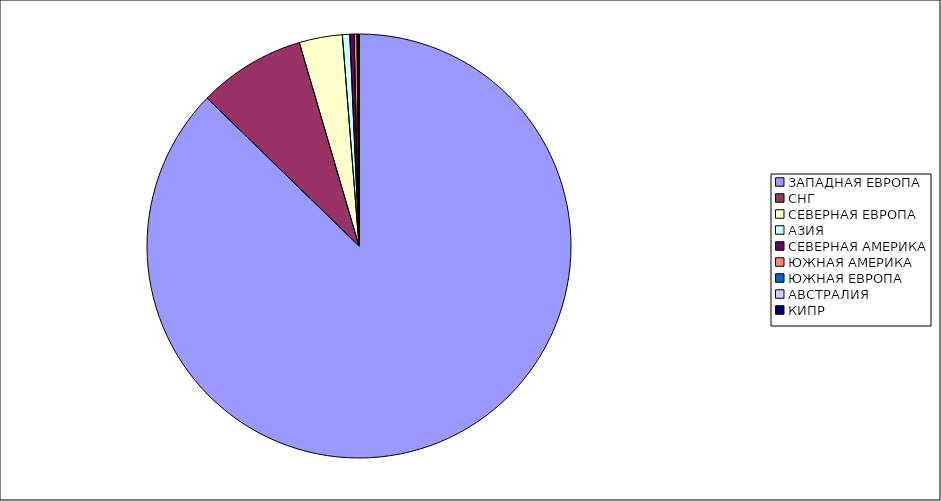
| Category | Оборот |
|---|---|
| ЗАПАДНАЯ ЕВРОПА | 0.873 |
| СНГ | 0.082 |
| СЕВЕРНАЯ ЕВРОПА | 0.033 |
| АЗИЯ | 0.006 |
| СЕВЕРНАЯ АМЕРИКА | 0.003 |
| ЮЖНАЯ АМЕРИКА | 0.002 |
| ЮЖНАЯ ЕВРОПА | 0.001 |
| АВСТРАЛИЯ | 0 |
| КИПР | 0 |